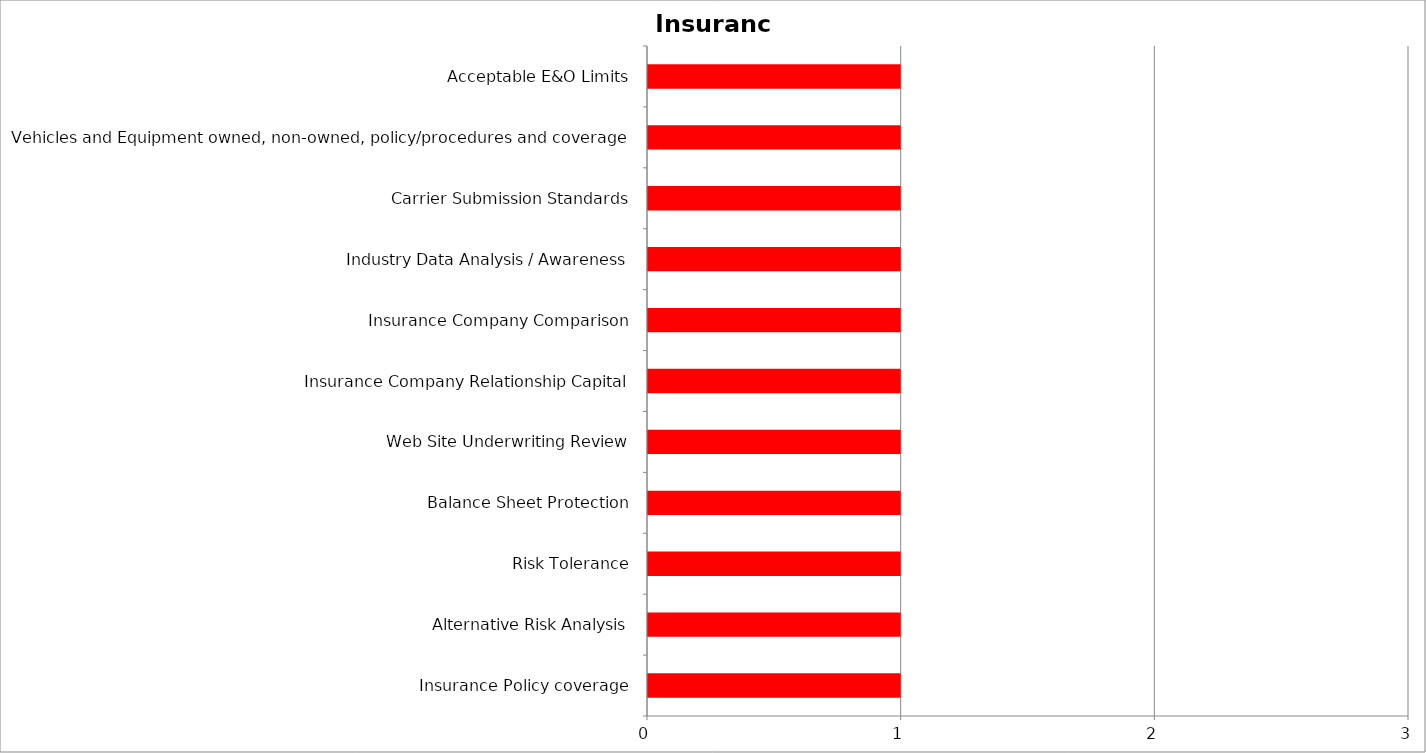
| Category | Low | Medium | High |
|---|---|---|---|
| Insurance Policy coverage | 0 | 0 | 1 |
| Alternative Risk Analysis | 0 | 0 | 1 |
| Risk Tolerance | 0 | 0 | 1 |
| Balance Sheet Protection | 0 | 0 | 1 |
| Web Site Underwriting Review | 0 | 0 | 1 |
| Insurance Company Relationship Capital | 0 | 0 | 1 |
| Insurance Company Comparison | 0 | 0 | 1 |
| Industry Data Analysis / Awareness | 0 | 0 | 1 |
| Carrier Submission Standards | 0 | 0 | 1 |
| Vehicles and Equipment owned, non-owned, policy/procedures and coverage | 0 | 0 | 1 |
| Acceptable E&O Limits | 0 | 0 | 1 |